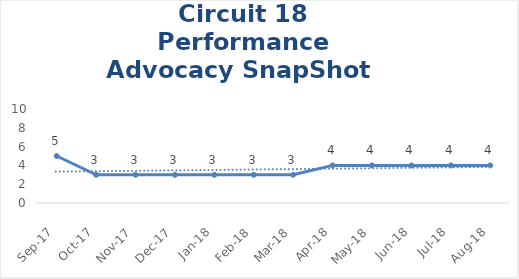
| Category | Circuit 18 |
|---|---|
| Sep-17 | 5 |
| Oct-17 | 3 |
| Nov-17 | 3 |
| Dec-17 | 3 |
| Jan-18 | 3 |
| Feb-18 | 3 |
| Mar-18 | 3 |
| Apr-18 | 4 |
| May-18 | 4 |
| Jun-18 | 4 |
| Jul-18 | 4 |
| Aug-18 | 4 |